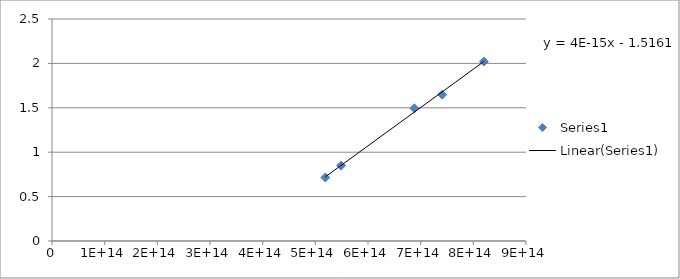
| Category | Series 0 |
|---|---|
| 819999999999999.9 | 2.021 |
| 741000000000000.0 | 1.648 |
| 688000000000000.0 | 1.494 |
| 549000000000000.0 | 0.849 |
| 519000000000000.06 | 0.715 |